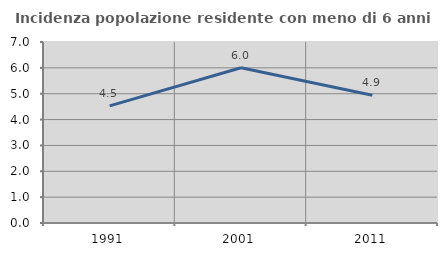
| Category | Incidenza popolazione residente con meno di 6 anni |
|---|---|
| 1991.0 | 4.531 |
| 2001.0 | 6.006 |
| 2011.0 | 4.943 |